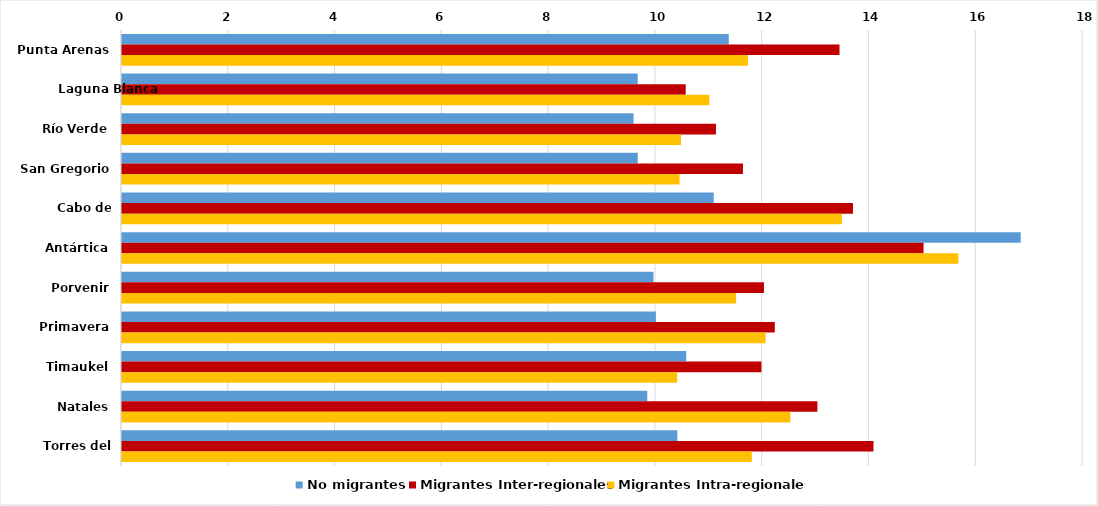
| Category | No migrantes | Migrantes Inter-regionales | Migrantes Intra-regionales |
|---|---|---|---|
| Punta Arenas | 11.366 | 13.439 | 11.725 |
| Laguna Blanca | 9.66 | 10.559 | 11 |
| Río Verde | 9.582 | 11.125 | 10.471 |
| San Gregorio | 9.661 | 11.631 | 10.444 |
| Cabo de Hornos | 11.084 | 13.692 | 13.484 |
| Antártica | 16.833 | 15.013 | 15.667 |
| Porvenir | 9.953 | 12.025 | 11.502 |
| Primavera | 10 | 12.227 | 12.055 |
| Timaukel | 10.569 | 11.977 | 10.398 |
| Natales | 9.838 | 13.025 | 12.519 |
| Torres del Paine | 10.402 | 14.076 | 11.796 |